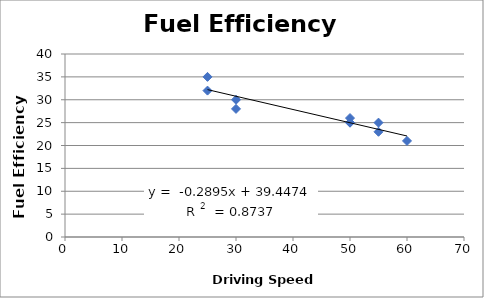
| Category | Fuel Efficiency (mile/gallon) |
|---|---|
| 30.0 | 28 |
| 50.0 | 25 |
| 50.0 | 25 |
| 55.0 | 23 |
| 30.0 | 30 |
| 25.0 | 32 |
| 60.0 | 21 |
| 25.0 | 35 |
| 50.0 | 26 |
| 55.0 | 25 |